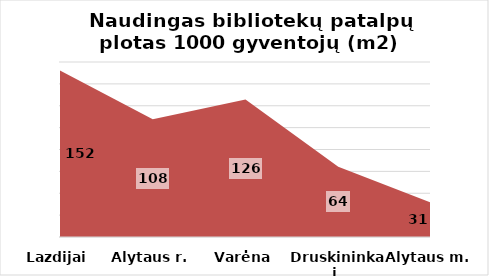
| Category | Series 0 |
|---|---|
| Lazdijai | 152.195 |
| Alytaus r. | 107.654 |
| Varėna | 125.828 |
| Druskininkai  | 64.314 |
| Alytaus m. | 31.42 |